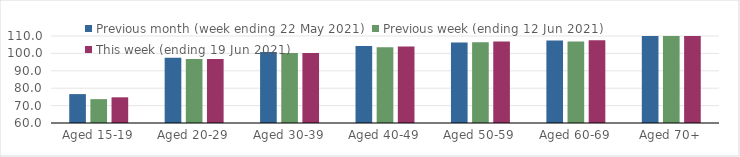
| Category | Previous month (week ending 22 May 2021) | Previous week (ending 12 Jun 2021) | This week (ending 19 Jun 2021) |
|---|---|---|---|
| Aged 15-19 | 76.61 | 73.71 | 74.77 |
| Aged 20-29 | 97.56 | 96.81 | 96.73 |
| Aged 30-39 | 100.82 | 100.28 | 100.29 |
| Aged 40-49 | 104.23 | 103.54 | 103.91 |
| Aged 50-59 | 106.3 | 106.43 | 106.87 |
| Aged 60-69 | 107.41 | 106.88 | 107.53 |
| Aged 70+ | 112.48 | 114.54 | 114.15 |